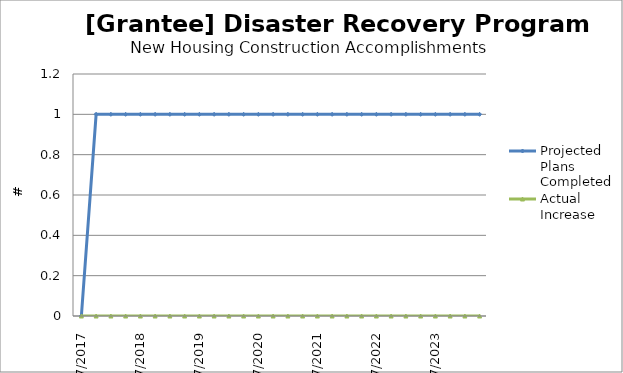
| Category | Projected Plans Completed | Actual Increase |
|---|---|---|
| 7/2017 | 0 | 0 |
| 10/2017 | 1 | 0 |
| 1/2018 | 1 | 0 |
| 4/2018 | 1 | 0 |
| 7/2018 | 1 | 0 |
| 10/2018 | 1 | 0 |
| 1/2019 | 1 | 0 |
| 4/2019 | 1 | 0 |
| 7/2019 | 1 | 0 |
| 10/2019 | 1 | 0 |
| 1/2020 | 1 | 0 |
| 4/2020 | 1 | 0 |
| 7/2020 | 1 | 0 |
| 10/2020 | 1 | 0 |
| 1/2021 | 1 | 0 |
| 4/2021 | 1 | 0 |
| 7/2021 | 1 | 0 |
| 10/2021 | 1 | 0 |
| 1/2022 | 1 | 0 |
| 4/2022 | 1 | 0 |
| 7/2022 | 1 | 0 |
| 10/2022 | 1 | 0 |
| 1/2023 | 1 | 0 |
| 4/2023 | 1 | 0 |
| 7/2023 | 1 | 0 |
| 10/2023 | 1 | 0 |
| 1/2024 | 1 | 0 |
| 4/2024 | 1 | 0 |